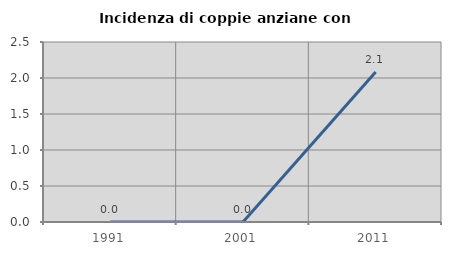
| Category | Incidenza di coppie anziane con figli |
|---|---|
| 1991.0 | 0 |
| 2001.0 | 0 |
| 2011.0 | 2.083 |